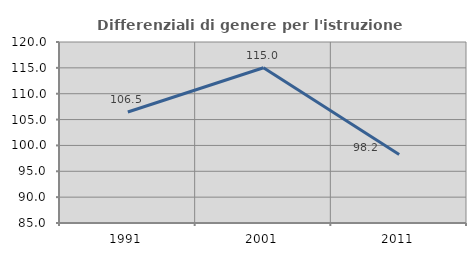
| Category | Differenziali di genere per l'istruzione superiore |
|---|---|
| 1991.0 | 106.474 |
| 2001.0 | 115.011 |
| 2011.0 | 98.237 |